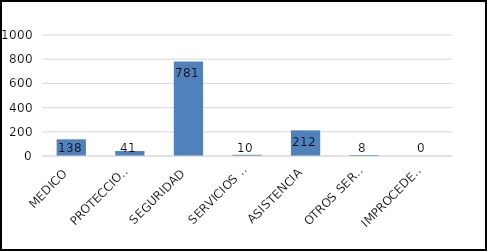
| Category | TOTAL |
|---|---|
| MEDICO | 138 |
| PROTECCION CIVIL | 41 |
| SEGURIDAD | 781 |
| SERVICIOS PUBLICOS | 10 |
| ASISTENCIA | 212 |
| OTROS SERVICIOS | 8 |
| IMPROCEDENTES | 0 |